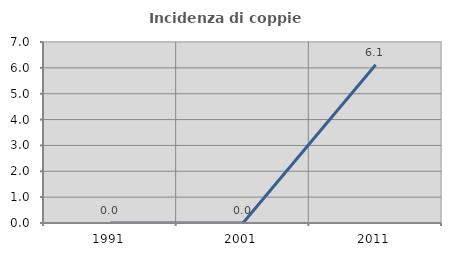
| Category | Incidenza di coppie miste |
|---|---|
| 1991.0 | 0 |
| 2001.0 | 0 |
| 2011.0 | 6.122 |